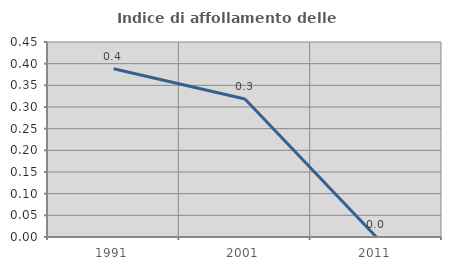
| Category | Indice di affollamento delle abitazioni  |
|---|---|
| 1991.0 | 0.388 |
| 2001.0 | 0.318 |
| 2011.0 | 0 |